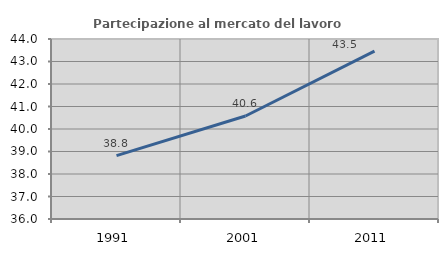
| Category | Partecipazione al mercato del lavoro  femminile |
|---|---|
| 1991.0 | 38.818 |
| 2001.0 | 40.577 |
| 2011.0 | 43.459 |